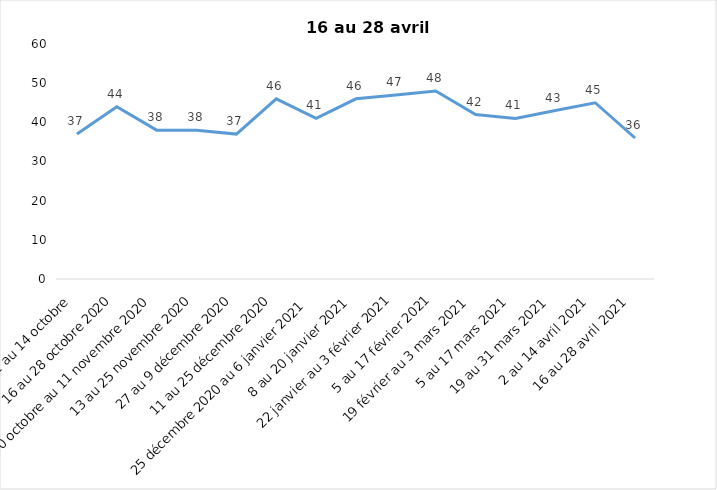
| Category | Toujours aux trois mesures |
|---|---|
| 2 au 14 octobre  | 37 |
| 16 au 28 octobre 2020 | 44 |
| 30 octobre au 11 novembre 2020 | 38 |
| 13 au 25 novembre 2020 | 38 |
| 27 au 9 décembre 2020 | 37 |
| 11 au 25 décembre 2020 | 46 |
| 25 décembre 2020 au 6 janvier 2021 | 41 |
| 8 au 20 janvier 2021 | 46 |
| 22 janvier au 3 février 2021 | 47 |
| 5 au 17 février 2021 | 48 |
| 19 février au 3 mars 2021 | 42 |
| 5 au 17 mars 2021 | 41 |
| 19 au 31 mars 2021 | 43 |
| 2 au 14 avril 2021 | 45 |
| 16 au 28 avril 2021 | 36 |